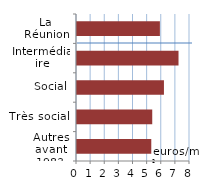
| Category | Series 0 |
|---|---|
| Autres avant 1983 | 5.259 |
| Très social | 5.327 |
| Social | 6.155 |
| Intermédiaire | 7.187 |
| La Réunion | 5.869 |